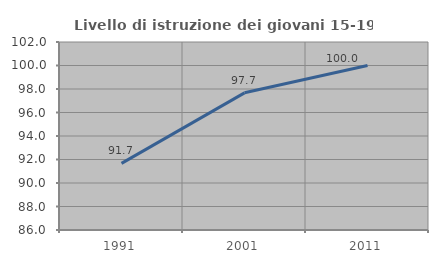
| Category | Livello di istruzione dei giovani 15-19 anni |
|---|---|
| 1991.0 | 91.667 |
| 2001.0 | 97.674 |
| 2011.0 | 100 |